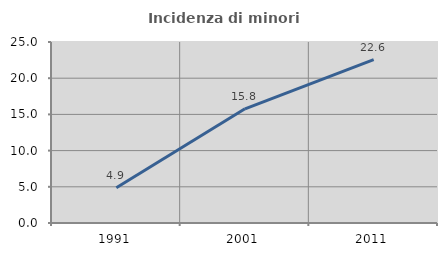
| Category | Incidenza di minori stranieri |
|---|---|
| 1991.0 | 4.878 |
| 2001.0 | 15.776 |
| 2011.0 | 22.567 |